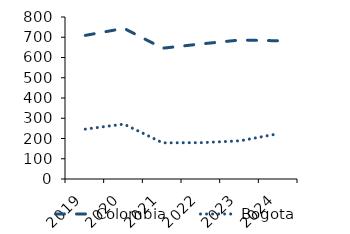
| Category | Colombia | Bogota |
|---|---|---|
| 2019.0 | 709.254 | 246.311 |
| 2020.0 | 743.947 | 271.132 |
| 2021.0 | 645.956 | 178.586 |
| 2022.0 | 667.083 | 179.363 |
| 2023.0 | 686.36 | 188.579 |
| 2024.0 | 682.535 | 223.996 |